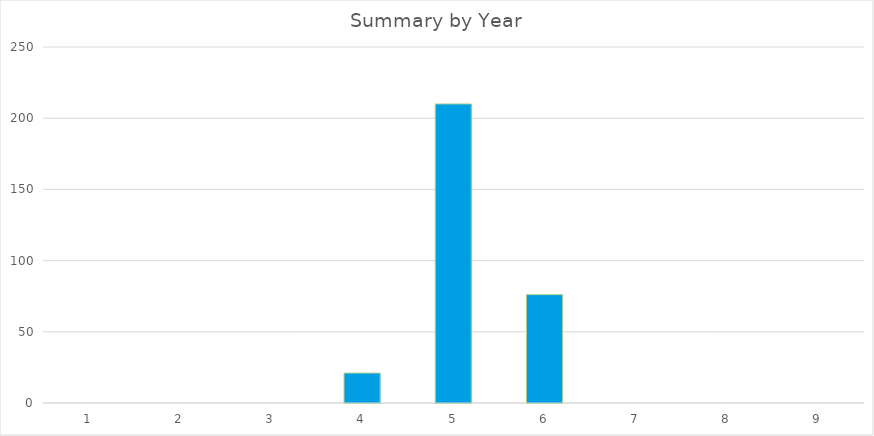
| Category | Total |
|---|---|
| 0 | 0 |
| 1 | 0 |
| 2 | 0 |
| 3 | 21 |
| 4 | 210 |
| 5 | 76.083 |
| 6 | 0 |
| 7 | 0 |
| 8 | 0 |